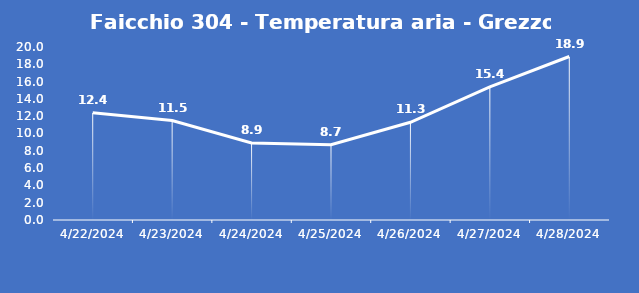
| Category | Faicchio 304 - Temperatura aria - Grezzo (°C) |
|---|---|
| 4/22/24 | 12.4 |
| 4/23/24 | 11.5 |
| 4/24/24 | 8.9 |
| 4/25/24 | 8.7 |
| 4/26/24 | 11.3 |
| 4/27/24 | 15.4 |
| 4/28/24 | 18.9 |